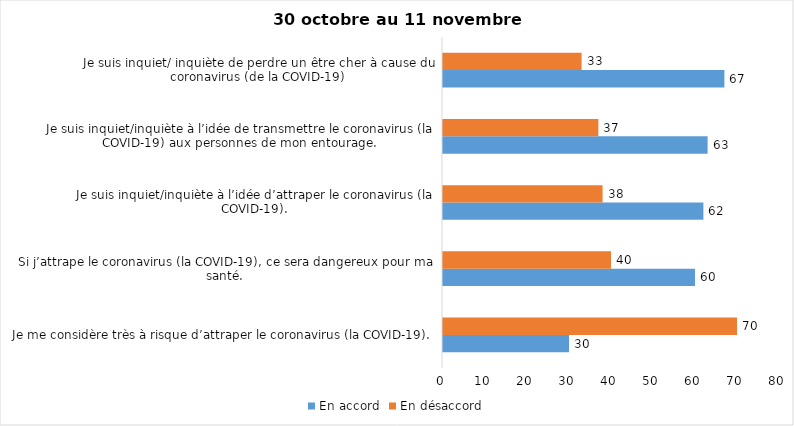
| Category | En accord | En désaccord |
|---|---|---|
| Je me considère très à risque d’attraper le coronavirus (la COVID-19). | 30 | 70 |
| Si j’attrape le coronavirus (la COVID-19), ce sera dangereux pour ma santé. | 60 | 40 |
| Je suis inquiet/inquiète à l’idée d’attraper le coronavirus (la COVID-19). | 62 | 38 |
| Je suis inquiet/inquiète à l’idée de transmettre le coronavirus (la COVID-19) aux personnes de mon entourage. | 63 | 37 |
| Je suis inquiet/ inquiète de perdre un être cher à cause du coronavirus (de la COVID-19) | 67 | 33 |